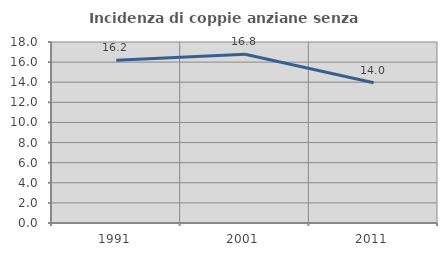
| Category | Incidenza di coppie anziane senza figli  |
|---|---|
| 1991.0 | 16.197 |
| 2001.0 | 16.783 |
| 2011.0 | 13.953 |